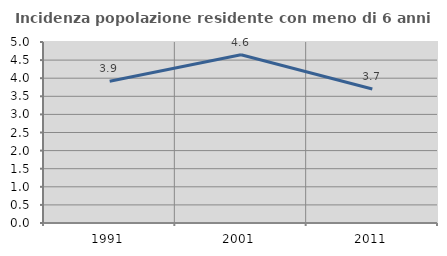
| Category | Incidenza popolazione residente con meno di 6 anni |
|---|---|
| 1991.0 | 3.918 |
| 2001.0 | 4.646 |
| 2011.0 | 3.704 |